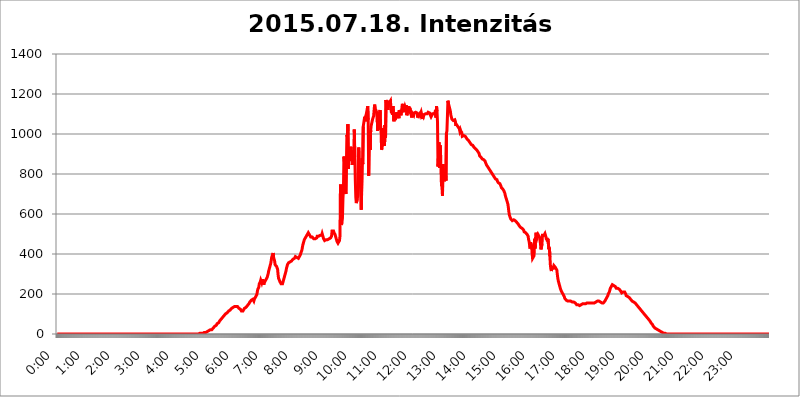
| Category | 2015.07.18. Intenzitás [W/m^2] |
|---|---|
| 0.0 | 0 |
| 0.0006944444444444445 | 0 |
| 0.001388888888888889 | 0 |
| 0.0020833333333333333 | 0 |
| 0.002777777777777778 | 0 |
| 0.003472222222222222 | 0 |
| 0.004166666666666667 | 0 |
| 0.004861111111111111 | 0 |
| 0.005555555555555556 | 0 |
| 0.0062499999999999995 | 0 |
| 0.006944444444444444 | 0 |
| 0.007638888888888889 | 0 |
| 0.008333333333333333 | 0 |
| 0.009027777777777779 | 0 |
| 0.009722222222222222 | 0 |
| 0.010416666666666666 | 0 |
| 0.011111111111111112 | 0 |
| 0.011805555555555555 | 0 |
| 0.012499999999999999 | 0 |
| 0.013194444444444444 | 0 |
| 0.013888888888888888 | 0 |
| 0.014583333333333332 | 0 |
| 0.015277777777777777 | 0 |
| 0.015972222222222224 | 0 |
| 0.016666666666666666 | 0 |
| 0.017361111111111112 | 0 |
| 0.018055555555555557 | 0 |
| 0.01875 | 0 |
| 0.019444444444444445 | 0 |
| 0.02013888888888889 | 0 |
| 0.020833333333333332 | 0 |
| 0.02152777777777778 | 0 |
| 0.022222222222222223 | 0 |
| 0.02291666666666667 | 0 |
| 0.02361111111111111 | 0 |
| 0.024305555555555556 | 0 |
| 0.024999999999999998 | 0 |
| 0.025694444444444447 | 0 |
| 0.02638888888888889 | 0 |
| 0.027083333333333334 | 0 |
| 0.027777777777777776 | 0 |
| 0.02847222222222222 | 0 |
| 0.029166666666666664 | 0 |
| 0.029861111111111113 | 0 |
| 0.030555555555555555 | 0 |
| 0.03125 | 0 |
| 0.03194444444444445 | 0 |
| 0.03263888888888889 | 0 |
| 0.03333333333333333 | 0 |
| 0.034027777777777775 | 0 |
| 0.034722222222222224 | 0 |
| 0.035416666666666666 | 0 |
| 0.036111111111111115 | 0 |
| 0.03680555555555556 | 0 |
| 0.0375 | 0 |
| 0.03819444444444444 | 0 |
| 0.03888888888888889 | 0 |
| 0.03958333333333333 | 0 |
| 0.04027777777777778 | 0 |
| 0.04097222222222222 | 0 |
| 0.041666666666666664 | 0 |
| 0.042361111111111106 | 0 |
| 0.04305555555555556 | 0 |
| 0.043750000000000004 | 0 |
| 0.044444444444444446 | 0 |
| 0.04513888888888889 | 0 |
| 0.04583333333333334 | 0 |
| 0.04652777777777778 | 0 |
| 0.04722222222222222 | 0 |
| 0.04791666666666666 | 0 |
| 0.04861111111111111 | 0 |
| 0.049305555555555554 | 0 |
| 0.049999999999999996 | 0 |
| 0.05069444444444445 | 0 |
| 0.051388888888888894 | 0 |
| 0.052083333333333336 | 0 |
| 0.05277777777777778 | 0 |
| 0.05347222222222222 | 0 |
| 0.05416666666666667 | 0 |
| 0.05486111111111111 | 0 |
| 0.05555555555555555 | 0 |
| 0.05625 | 0 |
| 0.05694444444444444 | 0 |
| 0.057638888888888885 | 0 |
| 0.05833333333333333 | 0 |
| 0.05902777777777778 | 0 |
| 0.059722222222222225 | 0 |
| 0.06041666666666667 | 0 |
| 0.061111111111111116 | 0 |
| 0.06180555555555556 | 0 |
| 0.0625 | 0 |
| 0.06319444444444444 | 0 |
| 0.06388888888888888 | 0 |
| 0.06458333333333334 | 0 |
| 0.06527777777777778 | 0 |
| 0.06597222222222222 | 0 |
| 0.06666666666666667 | 0 |
| 0.06736111111111111 | 0 |
| 0.06805555555555555 | 0 |
| 0.06874999999999999 | 0 |
| 0.06944444444444443 | 0 |
| 0.07013888888888889 | 0 |
| 0.07083333333333333 | 0 |
| 0.07152777777777779 | 0 |
| 0.07222222222222223 | 0 |
| 0.07291666666666667 | 0 |
| 0.07361111111111111 | 0 |
| 0.07430555555555556 | 0 |
| 0.075 | 0 |
| 0.07569444444444444 | 0 |
| 0.0763888888888889 | 0 |
| 0.07708333333333334 | 0 |
| 0.07777777777777778 | 0 |
| 0.07847222222222222 | 0 |
| 0.07916666666666666 | 0 |
| 0.0798611111111111 | 0 |
| 0.08055555555555556 | 0 |
| 0.08125 | 0 |
| 0.08194444444444444 | 0 |
| 0.08263888888888889 | 0 |
| 0.08333333333333333 | 0 |
| 0.08402777777777777 | 0 |
| 0.08472222222222221 | 0 |
| 0.08541666666666665 | 0 |
| 0.08611111111111112 | 0 |
| 0.08680555555555557 | 0 |
| 0.08750000000000001 | 0 |
| 0.08819444444444445 | 0 |
| 0.08888888888888889 | 0 |
| 0.08958333333333333 | 0 |
| 0.09027777777777778 | 0 |
| 0.09097222222222222 | 0 |
| 0.09166666666666667 | 0 |
| 0.09236111111111112 | 0 |
| 0.09305555555555556 | 0 |
| 0.09375 | 0 |
| 0.09444444444444444 | 0 |
| 0.09513888888888888 | 0 |
| 0.09583333333333333 | 0 |
| 0.09652777777777777 | 0 |
| 0.09722222222222222 | 0 |
| 0.09791666666666667 | 0 |
| 0.09861111111111111 | 0 |
| 0.09930555555555555 | 0 |
| 0.09999999999999999 | 0 |
| 0.10069444444444443 | 0 |
| 0.1013888888888889 | 0 |
| 0.10208333333333335 | 0 |
| 0.10277777777777779 | 0 |
| 0.10347222222222223 | 0 |
| 0.10416666666666667 | 0 |
| 0.10486111111111111 | 0 |
| 0.10555555555555556 | 0 |
| 0.10625 | 0 |
| 0.10694444444444444 | 0 |
| 0.1076388888888889 | 0 |
| 0.10833333333333334 | 0 |
| 0.10902777777777778 | 0 |
| 0.10972222222222222 | 0 |
| 0.1111111111111111 | 0 |
| 0.11180555555555556 | 0 |
| 0.11180555555555556 | 0 |
| 0.1125 | 0 |
| 0.11319444444444444 | 0 |
| 0.11388888888888889 | 0 |
| 0.11458333333333333 | 0 |
| 0.11527777777777777 | 0 |
| 0.11597222222222221 | 0 |
| 0.11666666666666665 | 0 |
| 0.1173611111111111 | 0 |
| 0.11805555555555557 | 0 |
| 0.11944444444444445 | 0 |
| 0.12013888888888889 | 0 |
| 0.12083333333333333 | 0 |
| 0.12152777777777778 | 0 |
| 0.12222222222222223 | 0 |
| 0.12291666666666667 | 0 |
| 0.12291666666666667 | 0 |
| 0.12361111111111112 | 0 |
| 0.12430555555555556 | 0 |
| 0.125 | 0 |
| 0.12569444444444444 | 0 |
| 0.12638888888888888 | 0 |
| 0.12708333333333333 | 0 |
| 0.16875 | 0 |
| 0.12847222222222224 | 0 |
| 0.12916666666666668 | 0 |
| 0.12986111111111112 | 0 |
| 0.13055555555555556 | 0 |
| 0.13125 | 0 |
| 0.13194444444444445 | 0 |
| 0.1326388888888889 | 0 |
| 0.13333333333333333 | 0 |
| 0.13402777777777777 | 0 |
| 0.13402777777777777 | 0 |
| 0.13472222222222222 | 0 |
| 0.13541666666666666 | 0 |
| 0.1361111111111111 | 0 |
| 0.13749999999999998 | 0 |
| 0.13819444444444443 | 0 |
| 0.1388888888888889 | 0 |
| 0.13958333333333334 | 0 |
| 0.14027777777777778 | 0 |
| 0.14097222222222222 | 0 |
| 0.14166666666666666 | 0 |
| 0.1423611111111111 | 0 |
| 0.14305555555555557 | 0 |
| 0.14375000000000002 | 0 |
| 0.14444444444444446 | 0 |
| 0.1451388888888889 | 0 |
| 0.1451388888888889 | 0 |
| 0.14652777777777778 | 0 |
| 0.14722222222222223 | 0 |
| 0.14791666666666667 | 0 |
| 0.1486111111111111 | 0 |
| 0.14930555555555555 | 0 |
| 0.15 | 0 |
| 0.15069444444444444 | 0 |
| 0.15138888888888888 | 0 |
| 0.15208333333333332 | 0 |
| 0.15277777777777776 | 0 |
| 0.15347222222222223 | 0 |
| 0.15416666666666667 | 0 |
| 0.15486111111111112 | 0 |
| 0.15555555555555556 | 0 |
| 0.15625 | 0 |
| 0.15694444444444444 | 0 |
| 0.15763888888888888 | 0 |
| 0.15833333333333333 | 0 |
| 0.15902777777777777 | 0 |
| 0.15972222222222224 | 0 |
| 0.16041666666666668 | 0 |
| 0.16111111111111112 | 0 |
| 0.16180555555555556 | 0 |
| 0.1625 | 0 |
| 0.16319444444444445 | 0 |
| 0.1638888888888889 | 0 |
| 0.16458333333333333 | 0 |
| 0.16527777777777777 | 0 |
| 0.16597222222222222 | 0 |
| 0.16666666666666666 | 0 |
| 0.1673611111111111 | 0 |
| 0.16805555555555554 | 0 |
| 0.16874999999999998 | 0 |
| 0.16944444444444443 | 0 |
| 0.17013888888888887 | 0 |
| 0.1708333333333333 | 0 |
| 0.17152777777777775 | 0 |
| 0.17222222222222225 | 0 |
| 0.1729166666666667 | 0 |
| 0.17361111111111113 | 0 |
| 0.17430555555555557 | 0 |
| 0.17500000000000002 | 0 |
| 0.17569444444444446 | 0 |
| 0.1763888888888889 | 0 |
| 0.17708333333333334 | 0 |
| 0.17777777777777778 | 0 |
| 0.17847222222222223 | 0 |
| 0.17916666666666667 | 0 |
| 0.1798611111111111 | 0 |
| 0.18055555555555555 | 0 |
| 0.18125 | 0 |
| 0.18194444444444444 | 0 |
| 0.1826388888888889 | 0 |
| 0.18333333333333335 | 0 |
| 0.1840277777777778 | 0 |
| 0.18472222222222223 | 0 |
| 0.18541666666666667 | 0 |
| 0.18611111111111112 | 0 |
| 0.18680555555555556 | 0 |
| 0.1875 | 0 |
| 0.18819444444444444 | 0 |
| 0.18888888888888888 | 0 |
| 0.18958333333333333 | 0 |
| 0.19027777777777777 | 0 |
| 0.1909722222222222 | 0 |
| 0.19166666666666665 | 0 |
| 0.19236111111111112 | 0 |
| 0.19305555555555554 | 0 |
| 0.19375 | 0 |
| 0.19444444444444445 | 0 |
| 0.1951388888888889 | 0 |
| 0.19583333333333333 | 0 |
| 0.19652777777777777 | 0 |
| 0.19722222222222222 | 0 |
| 0.19791666666666666 | 0 |
| 0.1986111111111111 | 0 |
| 0.19930555555555554 | 0 |
| 0.19999999999999998 | 3.525 |
| 0.20069444444444443 | 0 |
| 0.20138888888888887 | 3.525 |
| 0.2020833333333333 | 3.525 |
| 0.2027777777777778 | 3.525 |
| 0.2034722222222222 | 3.525 |
| 0.2041666666666667 | 3.525 |
| 0.20486111111111113 | 3.525 |
| 0.20555555555555557 | 3.525 |
| 0.20625000000000002 | 7.887 |
| 0.20694444444444446 | 7.887 |
| 0.2076388888888889 | 7.887 |
| 0.20833333333333334 | 7.887 |
| 0.20902777777777778 | 12.257 |
| 0.20972222222222223 | 12.257 |
| 0.21041666666666667 | 12.257 |
| 0.2111111111111111 | 12.257 |
| 0.21180555555555555 | 12.257 |
| 0.2125 | 16.636 |
| 0.21319444444444444 | 16.636 |
| 0.2138888888888889 | 16.636 |
| 0.21458333333333335 | 21.024 |
| 0.2152777777777778 | 21.024 |
| 0.21597222222222223 | 21.024 |
| 0.21666666666666667 | 21.024 |
| 0.21736111111111112 | 25.419 |
| 0.21805555555555556 | 25.419 |
| 0.21875 | 29.823 |
| 0.21944444444444444 | 29.823 |
| 0.22013888888888888 | 34.234 |
| 0.22083333333333333 | 38.653 |
| 0.22152777777777777 | 38.653 |
| 0.2222222222222222 | 43.079 |
| 0.22291666666666665 | 43.079 |
| 0.2236111111111111 | 47.511 |
| 0.22430555555555556 | 51.951 |
| 0.225 | 51.951 |
| 0.22569444444444445 | 56.398 |
| 0.2263888888888889 | 56.398 |
| 0.22708333333333333 | 60.85 |
| 0.22777777777777777 | 65.31 |
| 0.22847222222222222 | 65.31 |
| 0.22916666666666666 | 69.775 |
| 0.2298611111111111 | 74.246 |
| 0.23055555555555554 | 74.246 |
| 0.23124999999999998 | 78.722 |
| 0.23194444444444443 | 83.205 |
| 0.23263888888888887 | 83.205 |
| 0.2333333333333333 | 87.692 |
| 0.2340277777777778 | 92.184 |
| 0.2347222222222222 | 92.184 |
| 0.2354166666666667 | 96.682 |
| 0.23611111111111113 | 101.184 |
| 0.23680555555555557 | 101.184 |
| 0.23750000000000002 | 105.69 |
| 0.23819444444444446 | 105.69 |
| 0.2388888888888889 | 110.201 |
| 0.23958333333333334 | 110.201 |
| 0.24027777777777778 | 114.716 |
| 0.24097222222222223 | 114.716 |
| 0.24166666666666667 | 119.235 |
| 0.2423611111111111 | 119.235 |
| 0.24305555555555555 | 123.758 |
| 0.24375 | 123.758 |
| 0.24444444444444446 | 128.284 |
| 0.24513888888888888 | 128.284 |
| 0.24583333333333335 | 128.284 |
| 0.2465277777777778 | 132.814 |
| 0.24722222222222223 | 137.347 |
| 0.24791666666666667 | 137.347 |
| 0.24861111111111112 | 137.347 |
| 0.24930555555555556 | 137.347 |
| 0.25 | 132.814 |
| 0.25069444444444444 | 137.347 |
| 0.2513888888888889 | 137.347 |
| 0.2520833333333333 | 137.347 |
| 0.25277777777777777 | 137.347 |
| 0.2534722222222222 | 137.347 |
| 0.25416666666666665 | 132.814 |
| 0.2548611111111111 | 128.284 |
| 0.2555555555555556 | 123.758 |
| 0.25625000000000003 | 123.758 |
| 0.2569444444444445 | 123.758 |
| 0.2576388888888889 | 119.235 |
| 0.25833333333333336 | 114.716 |
| 0.2590277777777778 | 114.716 |
| 0.25972222222222224 | 110.201 |
| 0.2604166666666667 | 114.716 |
| 0.2611111111111111 | 114.716 |
| 0.26180555555555557 | 119.235 |
| 0.2625 | 128.284 |
| 0.26319444444444445 | 132.814 |
| 0.2638888888888889 | 132.814 |
| 0.26458333333333334 | 132.814 |
| 0.2652777777777778 | 132.814 |
| 0.2659722222222222 | 137.347 |
| 0.26666666666666666 | 141.884 |
| 0.2673611111111111 | 141.884 |
| 0.26805555555555555 | 146.423 |
| 0.26875 | 150.964 |
| 0.26944444444444443 | 155.509 |
| 0.2701388888888889 | 160.056 |
| 0.2708333333333333 | 164.605 |
| 0.27152777777777776 | 164.605 |
| 0.2722222222222222 | 169.156 |
| 0.27291666666666664 | 169.156 |
| 0.2736111111111111 | 169.156 |
| 0.2743055555555555 | 173.709 |
| 0.27499999999999997 | 173.709 |
| 0.27569444444444446 | 164.605 |
| 0.27638888888888885 | 173.709 |
| 0.27708333333333335 | 178.264 |
| 0.2777777777777778 | 182.82 |
| 0.27847222222222223 | 182.82 |
| 0.2791666666666667 | 187.378 |
| 0.2798611111111111 | 196.497 |
| 0.28055555555555556 | 210.182 |
| 0.28125 | 223.873 |
| 0.28194444444444444 | 228.436 |
| 0.2826388888888889 | 233 |
| 0.2833333333333333 | 251.251 |
| 0.28402777777777777 | 246.689 |
| 0.2847222222222222 | 260.373 |
| 0.28541666666666665 | 269.49 |
| 0.28611111111111115 | 264.932 |
| 0.28680555555555554 | 255.813 |
| 0.28750000000000003 | 260.373 |
| 0.2881944444444445 | 274.047 |
| 0.2888888888888889 | 260.373 |
| 0.28958333333333336 | 246.689 |
| 0.2902777777777778 | 255.813 |
| 0.29097222222222224 | 255.813 |
| 0.2916666666666667 | 260.373 |
| 0.2923611111111111 | 269.49 |
| 0.29305555555555557 | 274.047 |
| 0.29375 | 274.047 |
| 0.29444444444444445 | 283.156 |
| 0.2951388888888889 | 292.259 |
| 0.29583333333333334 | 301.354 |
| 0.2965277777777778 | 314.98 |
| 0.2972222222222222 | 324.052 |
| 0.29791666666666666 | 333.113 |
| 0.2986111111111111 | 342.162 |
| 0.29930555555555555 | 351.198 |
| 0.3 | 364.728 |
| 0.30069444444444443 | 382.715 |
| 0.3013888888888889 | 378.224 |
| 0.3020833333333333 | 387.202 |
| 0.30277777777777776 | 405.108 |
| 0.3034722222222222 | 382.715 |
| 0.30416666666666664 | 373.729 |
| 0.3048611111111111 | 364.728 |
| 0.3055555555555555 | 346.682 |
| 0.30624999999999997 | 342.162 |
| 0.3069444444444444 | 346.682 |
| 0.3076388888888889 | 337.639 |
| 0.30833333333333335 | 337.639 |
| 0.3090277777777778 | 324.052 |
| 0.30972222222222223 | 296.808 |
| 0.3104166666666667 | 278.603 |
| 0.3111111111111111 | 274.047 |
| 0.31180555555555556 | 274.047 |
| 0.3125 | 260.373 |
| 0.31319444444444444 | 255.813 |
| 0.3138888888888889 | 251.251 |
| 0.3145833333333333 | 251.251 |
| 0.31527777777777777 | 251.251 |
| 0.3159722222222222 | 251.251 |
| 0.31666666666666665 | 260.373 |
| 0.31736111111111115 | 264.932 |
| 0.31805555555555554 | 278.603 |
| 0.31875000000000003 | 283.156 |
| 0.3194444444444445 | 296.808 |
| 0.3201388888888889 | 305.898 |
| 0.32083333333333336 | 314.98 |
| 0.3215277777777778 | 328.584 |
| 0.32222222222222224 | 337.639 |
| 0.3229166666666667 | 346.682 |
| 0.3236111111111111 | 351.198 |
| 0.32430555555555557 | 355.712 |
| 0.325 | 360.221 |
| 0.32569444444444445 | 360.221 |
| 0.3263888888888889 | 360.221 |
| 0.32708333333333334 | 360.221 |
| 0.3277777777777778 | 364.728 |
| 0.3284722222222222 | 364.728 |
| 0.32916666666666666 | 369.23 |
| 0.3298611111111111 | 369.23 |
| 0.33055555555555555 | 373.729 |
| 0.33125 | 373.729 |
| 0.33194444444444443 | 378.224 |
| 0.3326388888888889 | 378.224 |
| 0.3333333333333333 | 382.715 |
| 0.3340277777777778 | 387.202 |
| 0.3347222222222222 | 387.202 |
| 0.3354166666666667 | 382.715 |
| 0.3361111111111111 | 382.715 |
| 0.3368055555555556 | 378.224 |
| 0.33749999999999997 | 378.224 |
| 0.33819444444444446 | 378.224 |
| 0.33888888888888885 | 382.715 |
| 0.33958333333333335 | 387.202 |
| 0.34027777777777773 | 391.685 |
| 0.34097222222222223 | 396.164 |
| 0.3416666666666666 | 405.108 |
| 0.3423611111111111 | 409.574 |
| 0.3430555555555555 | 418.492 |
| 0.34375 | 431.833 |
| 0.3444444444444445 | 445.129 |
| 0.3451388888888889 | 453.968 |
| 0.3458333333333334 | 462.786 |
| 0.34652777777777777 | 471.582 |
| 0.34722222222222227 | 475.972 |
| 0.34791666666666665 | 480.356 |
| 0.34861111111111115 | 484.735 |
| 0.34930555555555554 | 489.108 |
| 0.35000000000000003 | 493.475 |
| 0.3506944444444444 | 497.836 |
| 0.3513888888888889 | 502.192 |
| 0.3520833333333333 | 506.542 |
| 0.3527777777777778 | 506.542 |
| 0.3534722222222222 | 502.192 |
| 0.3541666666666667 | 493.475 |
| 0.3548611111111111 | 489.108 |
| 0.35555555555555557 | 484.735 |
| 0.35625 | 484.735 |
| 0.35694444444444445 | 480.356 |
| 0.3576388888888889 | 484.735 |
| 0.35833333333333334 | 480.356 |
| 0.3590277777777778 | 480.356 |
| 0.3597222222222222 | 475.972 |
| 0.36041666666666666 | 480.356 |
| 0.3611111111111111 | 471.582 |
| 0.36180555555555555 | 475.972 |
| 0.3625 | 475.972 |
| 0.36319444444444443 | 480.356 |
| 0.3638888888888889 | 480.356 |
| 0.3645833333333333 | 489.108 |
| 0.3652777777777778 | 489.108 |
| 0.3659722222222222 | 489.108 |
| 0.3666666666666667 | 489.108 |
| 0.3673611111111111 | 489.108 |
| 0.3680555555555556 | 489.108 |
| 0.36874999999999997 | 493.475 |
| 0.36944444444444446 | 489.108 |
| 0.37013888888888885 | 497.836 |
| 0.37083333333333335 | 493.475 |
| 0.37152777777777773 | 502.192 |
| 0.37222222222222223 | 493.475 |
| 0.3729166666666666 | 489.108 |
| 0.3736111111111111 | 475.972 |
| 0.3743055555555555 | 471.582 |
| 0.375 | 467.187 |
| 0.3756944444444445 | 471.582 |
| 0.3763888888888889 | 471.582 |
| 0.3770833333333334 | 471.582 |
| 0.37777777777777777 | 467.187 |
| 0.37847222222222227 | 467.187 |
| 0.37916666666666665 | 471.582 |
| 0.37986111111111115 | 471.582 |
| 0.38055555555555554 | 475.972 |
| 0.38125000000000003 | 475.972 |
| 0.3819444444444444 | 475.972 |
| 0.3826388888888889 | 475.972 |
| 0.3833333333333333 | 480.356 |
| 0.3840277777777778 | 480.356 |
| 0.3847222222222222 | 489.108 |
| 0.3854166666666667 | 515.223 |
| 0.3861111111111111 | 515.223 |
| 0.38680555555555557 | 515.223 |
| 0.3875 | 515.223 |
| 0.38819444444444445 | 506.542 |
| 0.3888888888888889 | 502.192 |
| 0.38958333333333334 | 497.836 |
| 0.3902777777777778 | 489.108 |
| 0.3909722222222222 | 480.356 |
| 0.39166666666666666 | 471.582 |
| 0.3923611111111111 | 462.786 |
| 0.39305555555555555 | 458.38 |
| 0.39375 | 453.968 |
| 0.39444444444444443 | 453.968 |
| 0.3951388888888889 | 458.38 |
| 0.3958333333333333 | 467.187 |
| 0.3965277777777778 | 489.108 |
| 0.3972222222222222 | 747.834 |
| 0.3979166666666667 | 588.009 |
| 0.3986111111111111 | 545.416 |
| 0.3993055555555556 | 558.261 |
| 0.39999999999999997 | 579.542 |
| 0.40069444444444446 | 675.311 |
| 0.40138888888888885 | 723.889 |
| 0.40208333333333335 | 887.309 |
| 0.40277777777777773 | 860.676 |
| 0.40347222222222223 | 751.803 |
| 0.4041666666666666 | 715.858 |
| 0.4048611111111111 | 699.717 |
| 0.4055555555555555 | 853.029 |
| 0.40625 | 996.182 |
| 0.4069444444444445 | 984.98 |
| 0.4076388888888889 | 1048.508 |
| 0.4083333333333334 | 826.123 |
| 0.40902777777777777 | 902.447 |
| 0.40972222222222227 | 875.918 |
| 0.41041666666666665 | 883.516 |
| 0.41111111111111115 | 864.493 |
| 0.41180555555555554 | 936.33 |
| 0.41250000000000003 | 887.309 |
| 0.4131944444444444 | 917.534 |
| 0.4138888888888889 | 845.365 |
| 0.4145833333333333 | 902.447 |
| 0.4152777777777778 | 879.719 |
| 0.4159722222222222 | 906.223 |
| 0.4166666666666667 | 1022.323 |
| 0.4173611111111111 | 883.516 |
| 0.41805555555555557 | 767.62 |
| 0.41875 | 683.473 |
| 0.41944444444444445 | 654.791 |
| 0.4201388888888889 | 654.791 |
| 0.42083333333333334 | 675.311 |
| 0.4215277777777778 | 695.666 |
| 0.4222222222222222 | 868.305 |
| 0.42291666666666666 | 932.576 |
| 0.4236111111111111 | 845.365 |
| 0.42430555555555555 | 829.981 |
| 0.425 | 783.342 |
| 0.42569444444444443 | 683.473 |
| 0.4263888888888889 | 621.613 |
| 0.4270833333333333 | 617.436 |
| 0.4277777777777778 | 879.719 |
| 0.4284722222222222 | 849.199 |
| 0.4291666666666667 | 1037.277 |
| 0.4298611111111111 | 1033.537 |
| 0.4305555555555556 | 1071.027 |
| 0.43124999999999997 | 1086.097 |
| 0.43194444444444446 | 1063.51 |
| 0.43263888888888885 | 1089.873 |
| 0.43333333333333335 | 1097.437 |
| 0.43402777777777773 | 1093.653 |
| 0.43472222222222223 | 1124.056 |
| 0.4354166666666666 | 1139.384 |
| 0.4361111111111111 | 1071.027 |
| 0.4368055555555555 | 791.169 |
| 0.4375 | 958.814 |
| 0.4381944444444445 | 999.916 |
| 0.4388888888888889 | 921.298 |
| 0.4395833333333334 | 1018.587 |
| 0.44027777777777777 | 1041.019 |
| 0.44097222222222227 | 1044.762 |
| 0.44166666666666665 | 1037.277 |
| 0.44236111111111115 | 1074.789 |
| 0.44305555555555554 | 1082.324 |
| 0.44375000000000003 | 1089.873 |
| 0.4444444444444444 | 1120.238 |
| 0.4451388888888889 | 1147.086 |
| 0.4458333333333333 | 1127.879 |
| 0.4465277777777778 | 1127.879 |
| 0.4472222222222222 | 1116.426 |
| 0.4479166666666667 | 1105.019 |
| 0.4486111111111111 | 1112.618 |
| 0.44930555555555557 | 1014.852 |
| 0.45 | 1063.51 |
| 0.45069444444444445 | 1022.323 |
| 0.4513888888888889 | 1059.756 |
| 0.45208333333333334 | 1097.437 |
| 0.4527777777777778 | 1120.238 |
| 0.4534722222222222 | 1041.019 |
| 0.45416666666666666 | 1014.852 |
| 0.4548611111111111 | 921.298 |
| 0.45555555555555555 | 928.819 |
| 0.45625 | 966.295 |
| 0.45694444444444443 | 1029.798 |
| 0.4576388888888889 | 962.555 |
| 0.4583333333333333 | 955.071 |
| 0.4590277777777778 | 940.082 |
| 0.4597222222222222 | 1044.762 |
| 0.4604166666666667 | 981.244 |
| 0.4611111111111111 | 1170.358 |
| 0.4618055555555556 | 1147.086 |
| 0.46249999999999997 | 1154.814 |
| 0.46319444444444446 | 1139.384 |
| 0.46388888888888885 | 1120.238 |
| 0.46458333333333335 | 1166.46 |
| 0.46527777777777773 | 1154.814 |
| 0.46597222222222223 | 1150.946 |
| 0.4666666666666666 | 1150.946 |
| 0.4673611111111111 | 1166.46 |
| 0.4680555555555555 | 1124.056 |
| 0.46875 | 1105.019 |
| 0.4694444444444445 | 1112.618 |
| 0.4701388888888889 | 1097.437 |
| 0.4708333333333334 | 1139.384 |
| 0.47152777777777777 | 1135.543 |
| 0.47222222222222227 | 1063.51 |
| 0.47291666666666665 | 1101.226 |
| 0.47361111111111115 | 1071.027 |
| 0.47430555555555554 | 1067.267 |
| 0.47500000000000003 | 1086.097 |
| 0.4756944444444444 | 1108.816 |
| 0.4763888888888889 | 1108.816 |
| 0.4770833333333333 | 1097.437 |
| 0.4777777777777778 | 1105.019 |
| 0.4784722222222222 | 1086.097 |
| 0.4791666666666667 | 1078.555 |
| 0.4798611111111111 | 1120.238 |
| 0.48055555555555557 | 1116.426 |
| 0.48125 | 1105.019 |
| 0.48194444444444445 | 1093.653 |
| 0.4826388888888889 | 1105.019 |
| 0.48333333333333334 | 1108.816 |
| 0.4840277777777778 | 1150.946 |
| 0.4847222222222222 | 1124.056 |
| 0.48541666666666666 | 1116.426 |
| 0.4861111111111111 | 1108.816 |
| 0.48680555555555555 | 1131.708 |
| 0.4875 | 1139.384 |
| 0.48819444444444443 | 1139.384 |
| 0.4888888888888889 | 1124.056 |
| 0.4895833333333333 | 1143.232 |
| 0.4902777777777778 | 1093.653 |
| 0.4909722222222222 | 1101.226 |
| 0.4916666666666667 | 1112.618 |
| 0.4923611111111111 | 1127.879 |
| 0.4930555555555556 | 1139.384 |
| 0.49374999999999997 | 1120.238 |
| 0.49444444444444446 | 1131.708 |
| 0.49513888888888885 | 1127.879 |
| 0.49583333333333335 | 1101.226 |
| 0.49652777777777773 | 1093.653 |
| 0.49722222222222223 | 1082.324 |
| 0.4979166666666666 | 1105.019 |
| 0.4986111111111111 | 1105.019 |
| 0.4993055555555555 | 1101.226 |
| 0.5 | 1093.653 |
| 0.5006944444444444 | 1105.019 |
| 0.5013888888888889 | 1101.226 |
| 0.5020833333333333 | 1101.226 |
| 0.5027777777777778 | 1108.816 |
| 0.5034722222222222 | 1105.019 |
| 0.5041666666666667 | 1105.019 |
| 0.5048611111111111 | 1105.019 |
| 0.5055555555555555 | 1082.324 |
| 0.50625 | 1105.019 |
| 0.5069444444444444 | 1093.653 |
| 0.5076388888888889 | 1093.653 |
| 0.5083333333333333 | 1101.226 |
| 0.5090277777777777 | 1093.653 |
| 0.5097222222222222 | 1089.873 |
| 0.5104166666666666 | 1108.816 |
| 0.5111111111111112 | 1112.618 |
| 0.5118055555555555 | 1112.618 |
| 0.5125000000000001 | 1074.789 |
| 0.5131944444444444 | 1097.437 |
| 0.513888888888889 | 1089.873 |
| 0.5145833333333333 | 1097.437 |
| 0.5152777777777778 | 1097.437 |
| 0.5159722222222222 | 1097.437 |
| 0.5166666666666667 | 1101.226 |
| 0.517361111111111 | 1101.226 |
| 0.5180555555555556 | 1101.226 |
| 0.5187499999999999 | 1101.226 |
| 0.5194444444444445 | 1105.019 |
| 0.5201388888888888 | 1108.816 |
| 0.5208333333333334 | 1108.816 |
| 0.5215277777777778 | 1108.816 |
| 0.5222222222222223 | 1105.019 |
| 0.5229166666666667 | 1097.437 |
| 0.5236111111111111 | 1093.653 |
| 0.5243055555555556 | 1086.097 |
| 0.525 | 1086.097 |
| 0.5256944444444445 | 1089.873 |
| 0.5263888888888889 | 1101.226 |
| 0.5270833333333333 | 1101.226 |
| 0.5277777777777778 | 1101.226 |
| 0.5284722222222222 | 1101.226 |
| 0.5291666666666667 | 1101.226 |
| 0.5298611111111111 | 1108.816 |
| 0.5305555555555556 | 1120.238 |
| 0.53125 | 1082.324 |
| 0.5319444444444444 | 1139.384 |
| 0.5326388888888889 | 1112.618 |
| 0.5333333333333333 | 1059.756 |
| 0.5340277777777778 | 837.682 |
| 0.5347222222222222 | 891.099 |
| 0.5354166666666667 | 958.814 |
| 0.5361111111111111 | 829.981 |
| 0.5368055555555555 | 943.832 |
| 0.5375 | 925.06 |
| 0.5381944444444444 | 822.26 |
| 0.5388888888888889 | 743.859 |
| 0.5395833333333333 | 735.89 |
| 0.5402777777777777 | 691.608 |
| 0.5409722222222222 | 849.199 |
| 0.5416666666666666 | 787.258 |
| 0.5423611111111112 | 810.641 |
| 0.5430555555555555 | 763.674 |
| 0.5437500000000001 | 798.974 |
| 0.5444444444444444 | 806.757 |
| 0.545138888888889 | 767.62 |
| 0.5458333333333333 | 1003.65 |
| 0.5465277777777778 | 1014.852 |
| 0.5472222222222222 | 1086.097 |
| 0.5479166666666667 | 1166.46 |
| 0.548611111111111 | 1154.814 |
| 0.5493055555555556 | 1143.232 |
| 0.5499999999999999 | 1139.384 |
| 0.5506944444444445 | 1124.056 |
| 0.5513888888888888 | 1112.618 |
| 0.5520833333333334 | 1093.653 |
| 0.5527777777777778 | 1093.653 |
| 0.5534722222222223 | 1074.789 |
| 0.5541666666666667 | 1074.789 |
| 0.5548611111111111 | 1078.555 |
| 0.5555555555555556 | 1067.267 |
| 0.55625 | 1071.027 |
| 0.5569444444444445 | 1071.027 |
| 0.5576388888888889 | 1071.027 |
| 0.5583333333333333 | 1063.51 |
| 0.5590277777777778 | 1041.019 |
| 0.5597222222222222 | 1048.508 |
| 0.5604166666666667 | 1044.762 |
| 0.5611111111111111 | 1041.019 |
| 0.5618055555555556 | 1037.277 |
| 0.5625 | 1033.537 |
| 0.5631944444444444 | 1029.798 |
| 0.5638888888888889 | 1026.06 |
| 0.5645833333333333 | 1014.852 |
| 0.5652777777777778 | 1022.323 |
| 0.5659722222222222 | 1014.852 |
| 0.5666666666666667 | 1011.118 |
| 0.5673611111111111 | 1007.383 |
| 0.5680555555555555 | 988.714 |
| 0.56875 | 992.448 |
| 0.5694444444444444 | 992.448 |
| 0.5701388888888889 | 992.448 |
| 0.5708333333333333 | 988.714 |
| 0.5715277777777777 | 992.448 |
| 0.5722222222222222 | 988.714 |
| 0.5729166666666666 | 984.98 |
| 0.5736111111111112 | 981.244 |
| 0.5743055555555555 | 977.508 |
| 0.5750000000000001 | 973.772 |
| 0.5756944444444444 | 970.034 |
| 0.576388888888889 | 970.034 |
| 0.5770833333333333 | 966.295 |
| 0.5777777777777778 | 962.555 |
| 0.5784722222222222 | 962.555 |
| 0.5791666666666667 | 955.071 |
| 0.579861111111111 | 951.327 |
| 0.5805555555555556 | 947.58 |
| 0.5812499999999999 | 947.58 |
| 0.5819444444444445 | 943.832 |
| 0.5826388888888888 | 943.832 |
| 0.5833333333333334 | 943.832 |
| 0.5840277777777778 | 940.082 |
| 0.5847222222222223 | 932.576 |
| 0.5854166666666667 | 932.576 |
| 0.5861111111111111 | 928.819 |
| 0.5868055555555556 | 925.06 |
| 0.5875 | 925.06 |
| 0.5881944444444445 | 921.298 |
| 0.5888888888888889 | 917.534 |
| 0.5895833333333333 | 913.766 |
| 0.5902777777777778 | 909.996 |
| 0.5909722222222222 | 906.223 |
| 0.5916666666666667 | 902.447 |
| 0.5923611111111111 | 891.099 |
| 0.5930555555555556 | 887.309 |
| 0.59375 | 887.309 |
| 0.5944444444444444 | 883.516 |
| 0.5951388888888889 | 883.516 |
| 0.5958333333333333 | 875.918 |
| 0.5965277777777778 | 872.114 |
| 0.5972222222222222 | 872.114 |
| 0.5979166666666667 | 872.114 |
| 0.5986111111111111 | 872.114 |
| 0.5993055555555555 | 868.305 |
| 0.6 | 864.493 |
| 0.6006944444444444 | 856.855 |
| 0.6013888888888889 | 853.029 |
| 0.6020833333333333 | 845.365 |
| 0.6027777777777777 | 841.526 |
| 0.6034722222222222 | 837.682 |
| 0.6041666666666666 | 833.834 |
| 0.6048611111111112 | 829.981 |
| 0.6055555555555555 | 826.123 |
| 0.6062500000000001 | 822.26 |
| 0.6069444444444444 | 818.392 |
| 0.607638888888889 | 814.519 |
| 0.6083333333333333 | 810.641 |
| 0.6090277777777778 | 806.757 |
| 0.6097222222222222 | 802.868 |
| 0.6104166666666667 | 798.974 |
| 0.611111111111111 | 795.074 |
| 0.6118055555555556 | 791.169 |
| 0.6124999999999999 | 787.258 |
| 0.6131944444444445 | 783.342 |
| 0.6138888888888888 | 779.42 |
| 0.6145833333333334 | 775.492 |
| 0.6152777777777778 | 771.559 |
| 0.6159722222222223 | 771.559 |
| 0.6166666666666667 | 771.559 |
| 0.6173611111111111 | 763.674 |
| 0.6180555555555556 | 759.723 |
| 0.61875 | 755.766 |
| 0.6194444444444445 | 755.766 |
| 0.6201388888888889 | 751.803 |
| 0.6208333333333333 | 751.803 |
| 0.6215277777777778 | 747.834 |
| 0.6222222222222222 | 739.877 |
| 0.6229166666666667 | 731.896 |
| 0.6236111111111111 | 727.896 |
| 0.6243055555555556 | 727.896 |
| 0.625 | 723.889 |
| 0.6256944444444444 | 719.877 |
| 0.6263888888888889 | 715.858 |
| 0.6270833333333333 | 711.832 |
| 0.6277777777777778 | 703.762 |
| 0.6284722222222222 | 691.608 |
| 0.6291666666666667 | 683.473 |
| 0.6298611111111111 | 675.311 |
| 0.6305555555555555 | 667.123 |
| 0.63125 | 658.909 |
| 0.6319444444444444 | 650.667 |
| 0.6326388888888889 | 634.105 |
| 0.6333333333333333 | 613.252 |
| 0.6340277777777777 | 596.45 |
| 0.6347222222222222 | 588.009 |
| 0.6354166666666666 | 583.779 |
| 0.6361111111111112 | 575.299 |
| 0.6368055555555555 | 571.049 |
| 0.6375000000000001 | 571.049 |
| 0.6381944444444444 | 566.793 |
| 0.638888888888889 | 571.049 |
| 0.6395833333333333 | 571.049 |
| 0.6402777777777778 | 571.049 |
| 0.6409722222222222 | 571.049 |
| 0.6416666666666667 | 566.793 |
| 0.642361111111111 | 566.793 |
| 0.6430555555555556 | 562.53 |
| 0.6437499999999999 | 562.53 |
| 0.6444444444444445 | 558.261 |
| 0.6451388888888888 | 558.261 |
| 0.6458333333333334 | 553.986 |
| 0.6465277777777778 | 549.704 |
| 0.6472222222222223 | 545.416 |
| 0.6479166666666667 | 541.121 |
| 0.6486111111111111 | 536.82 |
| 0.6493055555555556 | 536.82 |
| 0.65 | 532.513 |
| 0.6506944444444445 | 532.513 |
| 0.6513888888888889 | 532.513 |
| 0.6520833333333333 | 528.2 |
| 0.6527777777777778 | 523.88 |
| 0.6534722222222222 | 523.88 |
| 0.6541666666666667 | 519.555 |
| 0.6548611111111111 | 510.885 |
| 0.6555555555555556 | 510.885 |
| 0.65625 | 506.542 |
| 0.6569444444444444 | 506.542 |
| 0.6576388888888889 | 502.192 |
| 0.6583333333333333 | 502.192 |
| 0.6590277777777778 | 497.836 |
| 0.6597222222222222 | 497.836 |
| 0.6604166666666667 | 489.108 |
| 0.6611111111111111 | 471.582 |
| 0.6618055555555555 | 462.786 |
| 0.6625 | 458.38 |
| 0.6631944444444444 | 427.39 |
| 0.6638888888888889 | 458.38 |
| 0.6645833333333333 | 462.786 |
| 0.6652777777777777 | 440.702 |
| 0.6659722222222222 | 405.108 |
| 0.6666666666666666 | 378.224 |
| 0.6673611111111111 | 378.224 |
| 0.6680555555555556 | 382.715 |
| 0.6687500000000001 | 391.685 |
| 0.6694444444444444 | 475.972 |
| 0.6701388888888888 | 427.39 |
| 0.6708333333333334 | 480.356 |
| 0.6715277777777778 | 506.542 |
| 0.6722222222222222 | 489.108 |
| 0.6729166666666666 | 480.356 |
| 0.6736111111111112 | 489.108 |
| 0.6743055555555556 | 480.356 |
| 0.6749999999999999 | 493.475 |
| 0.6756944444444444 | 489.108 |
| 0.6763888888888889 | 484.735 |
| 0.6770833333333334 | 480.356 |
| 0.6777777777777777 | 449.551 |
| 0.6784722222222223 | 422.943 |
| 0.6791666666666667 | 422.943 |
| 0.6798611111111111 | 449.551 |
| 0.6805555555555555 | 493.475 |
| 0.68125 | 497.836 |
| 0.6819444444444445 | 493.475 |
| 0.6826388888888889 | 493.475 |
| 0.6833333333333332 | 493.475 |
| 0.6840277777777778 | 502.192 |
| 0.6847222222222222 | 497.836 |
| 0.6854166666666667 | 484.735 |
| 0.686111111111111 | 471.582 |
| 0.6868055555555556 | 480.356 |
| 0.6875 | 462.786 |
| 0.6881944444444444 | 475.972 |
| 0.688888888888889 | 471.582 |
| 0.6895833333333333 | 422.943 |
| 0.6902777777777778 | 431.833 |
| 0.6909722222222222 | 387.202 |
| 0.6916666666666668 | 342.162 |
| 0.6923611111111111 | 324.052 |
| 0.6930555555555555 | 314.98 |
| 0.69375 | 319.517 |
| 0.6944444444444445 | 337.639 |
| 0.6951388888888889 | 324.052 |
| 0.6958333333333333 | 333.113 |
| 0.6965277777777777 | 342.162 |
| 0.6972222222222223 | 342.162 |
| 0.6979166666666666 | 337.639 |
| 0.6986111111111111 | 333.113 |
| 0.6993055555555556 | 333.113 |
| 0.7000000000000001 | 333.113 |
| 0.7006944444444444 | 319.517 |
| 0.7013888888888888 | 296.808 |
| 0.7020833333333334 | 278.603 |
| 0.7027777777777778 | 264.932 |
| 0.7034722222222222 | 255.813 |
| 0.7041666666666666 | 246.689 |
| 0.7048611111111112 | 237.564 |
| 0.7055555555555556 | 228.436 |
| 0.7062499999999999 | 223.873 |
| 0.7069444444444444 | 214.746 |
| 0.7076388888888889 | 210.182 |
| 0.7083333333333334 | 205.62 |
| 0.7090277777777777 | 201.058 |
| 0.7097222222222223 | 196.497 |
| 0.7104166666666667 | 191.937 |
| 0.7111111111111111 | 187.378 |
| 0.7118055555555555 | 178.264 |
| 0.7125 | 173.709 |
| 0.7131944444444445 | 173.709 |
| 0.7138888888888889 | 169.156 |
| 0.7145833333333332 | 164.605 |
| 0.7152777777777778 | 164.605 |
| 0.7159722222222222 | 164.605 |
| 0.7166666666666667 | 164.605 |
| 0.717361111111111 | 164.605 |
| 0.7180555555555556 | 164.605 |
| 0.71875 | 164.605 |
| 0.7194444444444444 | 164.605 |
| 0.720138888888889 | 164.605 |
| 0.7208333333333333 | 164.605 |
| 0.7215277777777778 | 160.056 |
| 0.7222222222222222 | 160.056 |
| 0.7229166666666668 | 160.056 |
| 0.7236111111111111 | 160.056 |
| 0.7243055555555555 | 160.056 |
| 0.725 | 155.509 |
| 0.7256944444444445 | 155.509 |
| 0.7263888888888889 | 155.509 |
| 0.7270833333333333 | 150.964 |
| 0.7277777777777777 | 150.964 |
| 0.7284722222222223 | 146.423 |
| 0.7291666666666666 | 146.423 |
| 0.7298611111111111 | 146.423 |
| 0.7305555555555556 | 146.423 |
| 0.7312500000000001 | 141.884 |
| 0.7319444444444444 | 141.884 |
| 0.7326388888888888 | 141.884 |
| 0.7333333333333334 | 141.884 |
| 0.7340277777777778 | 146.423 |
| 0.7347222222222222 | 146.423 |
| 0.7354166666666666 | 146.423 |
| 0.7361111111111112 | 150.964 |
| 0.7368055555555556 | 150.964 |
| 0.7374999999999999 | 150.964 |
| 0.7381944444444444 | 150.964 |
| 0.7388888888888889 | 150.964 |
| 0.7395833333333334 | 146.423 |
| 0.7402777777777777 | 150.964 |
| 0.7409722222222223 | 150.964 |
| 0.7416666666666667 | 150.964 |
| 0.7423611111111111 | 150.964 |
| 0.7430555555555555 | 155.509 |
| 0.74375 | 155.509 |
| 0.7444444444444445 | 155.509 |
| 0.7451388888888889 | 155.509 |
| 0.7458333333333332 | 155.509 |
| 0.7465277777777778 | 155.509 |
| 0.7472222222222222 | 155.509 |
| 0.7479166666666667 | 155.509 |
| 0.748611111111111 | 155.509 |
| 0.7493055555555556 | 155.509 |
| 0.75 | 155.509 |
| 0.7506944444444444 | 155.509 |
| 0.751388888888889 | 155.509 |
| 0.7520833333333333 | 155.509 |
| 0.7527777777777778 | 155.509 |
| 0.7534722222222222 | 155.509 |
| 0.7541666666666668 | 155.509 |
| 0.7548611111111111 | 160.056 |
| 0.7555555555555555 | 160.056 |
| 0.75625 | 160.056 |
| 0.7569444444444445 | 160.056 |
| 0.7576388888888889 | 164.605 |
| 0.7583333333333333 | 164.605 |
| 0.7590277777777777 | 164.605 |
| 0.7597222222222223 | 164.605 |
| 0.7604166666666666 | 164.605 |
| 0.7611111111111111 | 164.605 |
| 0.7618055555555556 | 160.056 |
| 0.7625000000000001 | 160.056 |
| 0.7631944444444444 | 155.509 |
| 0.7638888888888888 | 155.509 |
| 0.7645833333333334 | 155.509 |
| 0.7652777777777778 | 155.509 |
| 0.7659722222222222 | 155.509 |
| 0.7666666666666666 | 160.056 |
| 0.7673611111111112 | 160.056 |
| 0.7680555555555556 | 164.605 |
| 0.7687499999999999 | 169.156 |
| 0.7694444444444444 | 173.709 |
| 0.7701388888888889 | 178.264 |
| 0.7708333333333334 | 182.82 |
| 0.7715277777777777 | 187.378 |
| 0.7722222222222223 | 191.937 |
| 0.7729166666666667 | 201.058 |
| 0.7736111111111111 | 205.62 |
| 0.7743055555555555 | 210.182 |
| 0.775 | 219.309 |
| 0.7756944444444445 | 228.436 |
| 0.7763888888888889 | 233 |
| 0.7770833333333332 | 237.564 |
| 0.7777777777777778 | 242.127 |
| 0.7784722222222222 | 246.689 |
| 0.7791666666666667 | 246.689 |
| 0.779861111111111 | 246.689 |
| 0.7805555555555556 | 242.127 |
| 0.78125 | 242.127 |
| 0.7819444444444444 | 242.127 |
| 0.782638888888889 | 237.564 |
| 0.7833333333333333 | 233 |
| 0.7840277777777778 | 228.436 |
| 0.7847222222222222 | 228.436 |
| 0.7854166666666668 | 228.436 |
| 0.7861111111111111 | 228.436 |
| 0.7868055555555555 | 223.873 |
| 0.7875 | 228.436 |
| 0.7881944444444445 | 223.873 |
| 0.7888888888888889 | 223.873 |
| 0.7895833333333333 | 219.309 |
| 0.7902777777777777 | 214.746 |
| 0.7909722222222223 | 214.746 |
| 0.7916666666666666 | 205.62 |
| 0.7923611111111111 | 205.62 |
| 0.7930555555555556 | 205.62 |
| 0.7937500000000001 | 210.182 |
| 0.7944444444444444 | 210.182 |
| 0.7951388888888888 | 210.182 |
| 0.7958333333333334 | 210.182 |
| 0.7965277777777778 | 205.62 |
| 0.7972222222222222 | 201.058 |
| 0.7979166666666666 | 191.937 |
| 0.7986111111111112 | 191.937 |
| 0.7993055555555556 | 187.378 |
| 0.7999999999999999 | 187.378 |
| 0.8006944444444444 | 187.378 |
| 0.8013888888888889 | 187.378 |
| 0.8020833333333334 | 182.82 |
| 0.8027777777777777 | 178.264 |
| 0.8034722222222223 | 178.264 |
| 0.8041666666666667 | 173.709 |
| 0.8048611111111111 | 173.709 |
| 0.8055555555555555 | 169.156 |
| 0.80625 | 164.605 |
| 0.8069444444444445 | 164.605 |
| 0.8076388888888889 | 160.056 |
| 0.8083333333333332 | 160.056 |
| 0.8090277777777778 | 155.509 |
| 0.8097222222222222 | 155.509 |
| 0.8104166666666667 | 155.509 |
| 0.811111111111111 | 150.964 |
| 0.8118055555555556 | 150.964 |
| 0.8125 | 146.423 |
| 0.8131944444444444 | 146.423 |
| 0.813888888888889 | 141.884 |
| 0.8145833333333333 | 137.347 |
| 0.8152777777777778 | 137.347 |
| 0.8159722222222222 | 132.814 |
| 0.8166666666666668 | 128.284 |
| 0.8173611111111111 | 123.758 |
| 0.8180555555555555 | 123.758 |
| 0.81875 | 119.235 |
| 0.8194444444444445 | 119.235 |
| 0.8201388888888889 | 114.716 |
| 0.8208333333333333 | 110.201 |
| 0.8215277777777777 | 110.201 |
| 0.8222222222222223 | 105.69 |
| 0.8229166666666666 | 101.184 |
| 0.8236111111111111 | 101.184 |
| 0.8243055555555556 | 96.682 |
| 0.8250000000000001 | 92.184 |
| 0.8256944444444444 | 92.184 |
| 0.8263888888888888 | 87.692 |
| 0.8270833333333334 | 83.205 |
| 0.8277777777777778 | 83.205 |
| 0.8284722222222222 | 78.722 |
| 0.8291666666666666 | 74.246 |
| 0.8298611111111112 | 69.775 |
| 0.8305555555555556 | 69.775 |
| 0.8312499999999999 | 65.31 |
| 0.8319444444444444 | 60.85 |
| 0.8326388888888889 | 56.398 |
| 0.8333333333333334 | 56.398 |
| 0.8340277777777777 | 51.951 |
| 0.8347222222222223 | 47.511 |
| 0.8354166666666667 | 43.079 |
| 0.8361111111111111 | 38.653 |
| 0.8368055555555555 | 38.653 |
| 0.8375 | 34.234 |
| 0.8381944444444445 | 29.823 |
| 0.8388888888888889 | 29.823 |
| 0.8395833333333332 | 25.419 |
| 0.8402777777777778 | 25.419 |
| 0.8409722222222222 | 21.024 |
| 0.8416666666666667 | 21.024 |
| 0.842361111111111 | 21.024 |
| 0.8430555555555556 | 16.636 |
| 0.84375 | 16.636 |
| 0.8444444444444444 | 16.636 |
| 0.845138888888889 | 12.257 |
| 0.8458333333333333 | 12.257 |
| 0.8465277777777778 | 12.257 |
| 0.8472222222222222 | 12.257 |
| 0.8479166666666668 | 7.887 |
| 0.8486111111111111 | 7.887 |
| 0.8493055555555555 | 7.887 |
| 0.85 | 3.525 |
| 0.8506944444444445 | 3.525 |
| 0.8513888888888889 | 3.525 |
| 0.8520833333333333 | 3.525 |
| 0.8527777777777777 | 3.525 |
| 0.8534722222222223 | 3.525 |
| 0.8541666666666666 | 3.525 |
| 0.8548611111111111 | 0 |
| 0.8555555555555556 | 0 |
| 0.8562500000000001 | 0 |
| 0.8569444444444444 | 0 |
| 0.8576388888888888 | 0 |
| 0.8583333333333334 | 0 |
| 0.8590277777777778 | 0 |
| 0.8597222222222222 | 0 |
| 0.8604166666666666 | 0 |
| 0.8611111111111112 | 0 |
| 0.8618055555555556 | 0 |
| 0.8624999999999999 | 0 |
| 0.8631944444444444 | 0 |
| 0.8638888888888889 | 0 |
| 0.8645833333333334 | 0 |
| 0.8652777777777777 | 0 |
| 0.8659722222222223 | 0 |
| 0.8666666666666667 | 0 |
| 0.8673611111111111 | 0 |
| 0.8680555555555555 | 0 |
| 0.86875 | 0 |
| 0.8694444444444445 | 0 |
| 0.8701388888888889 | 0 |
| 0.8708333333333332 | 0 |
| 0.8715277777777778 | 0 |
| 0.8722222222222222 | 0 |
| 0.8729166666666667 | 0 |
| 0.873611111111111 | 0 |
| 0.8743055555555556 | 0 |
| 0.875 | 0 |
| 0.8756944444444444 | 0 |
| 0.876388888888889 | 0 |
| 0.8770833333333333 | 0 |
| 0.8777777777777778 | 0 |
| 0.8784722222222222 | 0 |
| 0.8791666666666668 | 0 |
| 0.8798611111111111 | 0 |
| 0.8805555555555555 | 0 |
| 0.88125 | 0 |
| 0.8819444444444445 | 0 |
| 0.8826388888888889 | 0 |
| 0.8833333333333333 | 0 |
| 0.8840277777777777 | 0 |
| 0.8847222222222223 | 0 |
| 0.8854166666666666 | 0 |
| 0.8861111111111111 | 0 |
| 0.8868055555555556 | 0 |
| 0.8875000000000001 | 0 |
| 0.8881944444444444 | 0 |
| 0.8888888888888888 | 0 |
| 0.8895833333333334 | 0 |
| 0.8902777777777778 | 0 |
| 0.8909722222222222 | 0 |
| 0.8916666666666666 | 0 |
| 0.8923611111111112 | 0 |
| 0.8930555555555556 | 0 |
| 0.8937499999999999 | 0 |
| 0.8944444444444444 | 0 |
| 0.8951388888888889 | 0 |
| 0.8958333333333334 | 0 |
| 0.8965277777777777 | 0 |
| 0.8972222222222223 | 0 |
| 0.8979166666666667 | 0 |
| 0.8986111111111111 | 0 |
| 0.8993055555555555 | 0 |
| 0.9 | 0 |
| 0.9006944444444445 | 0 |
| 0.9013888888888889 | 0 |
| 0.9020833333333332 | 0 |
| 0.9027777777777778 | 0 |
| 0.9034722222222222 | 0 |
| 0.9041666666666667 | 0 |
| 0.904861111111111 | 0 |
| 0.9055555555555556 | 0 |
| 0.90625 | 0 |
| 0.9069444444444444 | 0 |
| 0.907638888888889 | 0 |
| 0.9083333333333333 | 0 |
| 0.9090277777777778 | 0 |
| 0.9097222222222222 | 0 |
| 0.9104166666666668 | 0 |
| 0.9111111111111111 | 0 |
| 0.9118055555555555 | 0 |
| 0.9125 | 0 |
| 0.9131944444444445 | 0 |
| 0.9138888888888889 | 0 |
| 0.9145833333333333 | 0 |
| 0.9152777777777777 | 0 |
| 0.9159722222222223 | 0 |
| 0.9166666666666666 | 0 |
| 0.9173611111111111 | 0 |
| 0.9180555555555556 | 0 |
| 0.9187500000000001 | 0 |
| 0.9194444444444444 | 0 |
| 0.9201388888888888 | 0 |
| 0.9208333333333334 | 0 |
| 0.9215277777777778 | 0 |
| 0.9222222222222222 | 0 |
| 0.9229166666666666 | 0 |
| 0.9236111111111112 | 0 |
| 0.9243055555555556 | 0 |
| 0.9249999999999999 | 0 |
| 0.9256944444444444 | 0 |
| 0.9263888888888889 | 0 |
| 0.9270833333333334 | 0 |
| 0.9277777777777777 | 0 |
| 0.9284722222222223 | 0 |
| 0.9291666666666667 | 0 |
| 0.9298611111111111 | 0 |
| 0.9305555555555555 | 0 |
| 0.93125 | 0 |
| 0.9319444444444445 | 0 |
| 0.9326388888888889 | 0 |
| 0.9333333333333332 | 0 |
| 0.9340277777777778 | 0 |
| 0.9347222222222222 | 0 |
| 0.9354166666666667 | 0 |
| 0.936111111111111 | 0 |
| 0.9368055555555556 | 0 |
| 0.9375 | 0 |
| 0.9381944444444444 | 0 |
| 0.938888888888889 | 0 |
| 0.9395833333333333 | 0 |
| 0.9402777777777778 | 0 |
| 0.9409722222222222 | 0 |
| 0.9416666666666668 | 0 |
| 0.9423611111111111 | 0 |
| 0.9430555555555555 | 0 |
| 0.94375 | 0 |
| 0.9444444444444445 | 0 |
| 0.9451388888888889 | 0 |
| 0.9458333333333333 | 0 |
| 0.9465277777777777 | 0 |
| 0.9472222222222223 | 0 |
| 0.9479166666666666 | 0 |
| 0.9486111111111111 | 0 |
| 0.9493055555555556 | 0 |
| 0.9500000000000001 | 0 |
| 0.9506944444444444 | 0 |
| 0.9513888888888888 | 0 |
| 0.9520833333333334 | 0 |
| 0.9527777777777778 | 0 |
| 0.9534722222222222 | 0 |
| 0.9541666666666666 | 0 |
| 0.9548611111111112 | 0 |
| 0.9555555555555556 | 0 |
| 0.9562499999999999 | 0 |
| 0.9569444444444444 | 0 |
| 0.9576388888888889 | 0 |
| 0.9583333333333334 | 0 |
| 0.9590277777777777 | 0 |
| 0.9597222222222223 | 0 |
| 0.9604166666666667 | 0 |
| 0.9611111111111111 | 0 |
| 0.9618055555555555 | 0 |
| 0.9625 | 0 |
| 0.9631944444444445 | 0 |
| 0.9638888888888889 | 0 |
| 0.9645833333333332 | 0 |
| 0.9652777777777778 | 0 |
| 0.9659722222222222 | 0 |
| 0.9666666666666667 | 0 |
| 0.967361111111111 | 0 |
| 0.9680555555555556 | 0 |
| 0.96875 | 0 |
| 0.9694444444444444 | 0 |
| 0.970138888888889 | 0 |
| 0.9708333333333333 | 0 |
| 0.9715277777777778 | 0 |
| 0.9722222222222222 | 0 |
| 0.9729166666666668 | 0 |
| 0.9736111111111111 | 0 |
| 0.9743055555555555 | 0 |
| 0.975 | 0 |
| 0.9756944444444445 | 0 |
| 0.9763888888888889 | 0 |
| 0.9770833333333333 | 0 |
| 0.9777777777777777 | 0 |
| 0.9784722222222223 | 0 |
| 0.9791666666666666 | 0 |
| 0.9798611111111111 | 0 |
| 0.9805555555555556 | 0 |
| 0.9812500000000001 | 0 |
| 0.9819444444444444 | 0 |
| 0.9826388888888888 | 0 |
| 0.9833333333333334 | 0 |
| 0.9840277777777778 | 0 |
| 0.9847222222222222 | 0 |
| 0.9854166666666666 | 0 |
| 0.9861111111111112 | 0 |
| 0.9868055555555556 | 0 |
| 0.9874999999999999 | 0 |
| 0.9881944444444444 | 0 |
| 0.9888888888888889 | 0 |
| 0.9895833333333334 | 0 |
| 0.9902777777777777 | 0 |
| 0.9909722222222223 | 0 |
| 0.9916666666666667 | 0 |
| 0.9923611111111111 | 0 |
| 0.9930555555555555 | 0 |
| 0.99375 | 0 |
| 0.9944444444444445 | 0 |
| 0.9951388888888889 | 0 |
| 0.9958333333333332 | 0 |
| 0.9965277777777778 | 0 |
| 0.9972222222222222 | 0 |
| 0.9979166666666667 | 0 |
| 0.998611111111111 | 0 |
| 0.9993055555555556 | 0 |